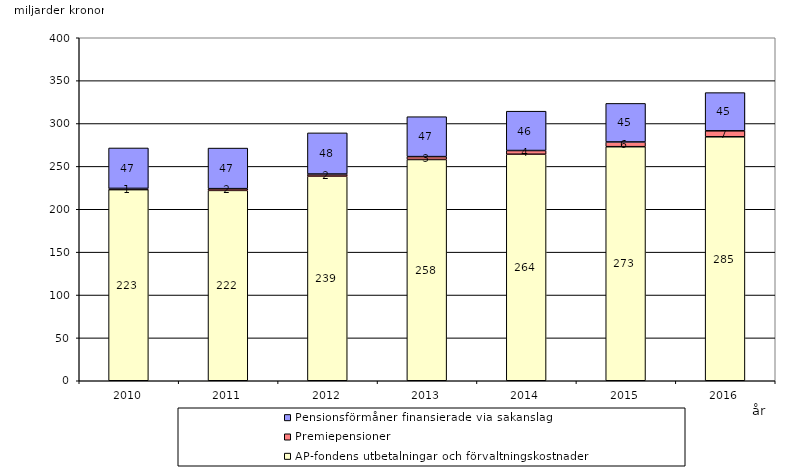
| Category | AP-fondens utbetalningar och förvaltningskostnader | Premiepensioner | Pensionsförmåner finansierade via sakanslag |
|---|---|---|---|
| 2010.0 | 222.897 | 1.412 | 47.171 |
| 2011.0 | 222.004 | 2.022 | 47.319 |
| 2012.0 | 238.62 | 2.453 | 47.988 |
| 2013.0 | 258.035 | 3.336 | 46.557 |
| 2014.0 | 264.16 | 4.327 | 45.884 |
| 2015.0 | 272.949 | 5.535 | 44.958 |
| 2016.0 | 284.524 | 6.966 | 44.518 |